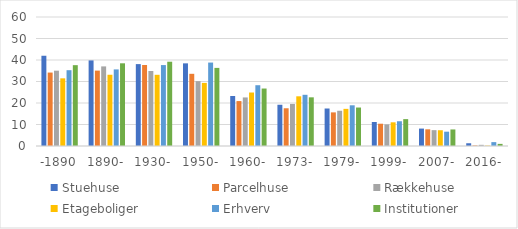
| Category | Stuehuse | Parcelhuse | Rækkehuse | Etageboliger | Erhverv | Institutioner |
|---|---|---|---|---|---|---|
| -1890 | 41.974 | 34.158 | 35.026 | 31.468 | 35.26 | 37.599 |
| 1890- | 39.801 | 35.068 | 37.021 | 33.135 | 35.626 | 38.466 |
| 1930- | 38.091 | 37.676 | 34.882 | 33.116 | 37.641 | 39.204 |
| 1950- | 38.443 | 33.577 | 30.163 | 29.352 | 38.808 | 36.328 |
| 1960- | 23.269 | 20.9 | 22.586 | 24.88 | 28.271 | 26.733 |
| 1973- | 19.184 | 17.55 | 19.57 | 23.113 | 23.814 | 22.638 |
| 1979- | 17.441 | 15.639 | 16.393 | 17.276 | 18.932 | 17.897 |
| 1999- | 11.164 | 10.359 | 10.058 | 11.018 | 11.515 | 12.503 |
| 2007- | 8.101 | 7.76 | 7.369 | 7.337 | 6.658 | 7.698 |
| 2016- | 1.279 | 0.247 | 0.547 | 0.173 | 1.804 | 0.987 |